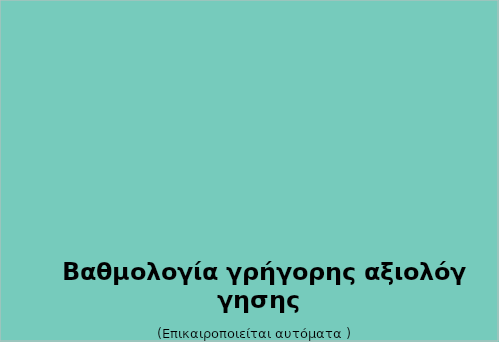
| Category | Βαθμολογία γρήγορης αξιολόγησης |
|---|---|
|  | 0 |
|  | 0 |
|  | 0 |